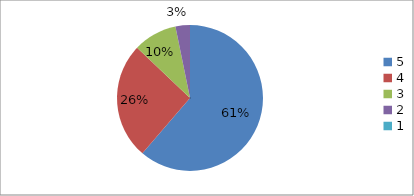
| Category | Series 0 | Series 1 |
|---|---|---|
| 5.0 | 61.3 | 61.3 |
| 4.0 | 25.8 | 25.8 |
| 3.0 | 9.7 | 9.7 |
| 2.0 | 3.2 | 3.2 |
| 1.0 | 0 | 0 |